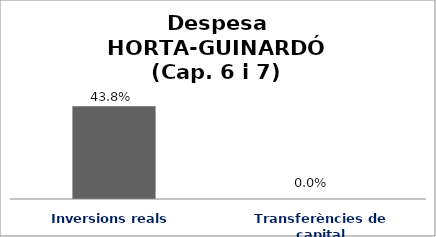
| Category | Series 0 |
|---|---|
| Inversions reals | 0.438 |
| Transferències de capital | 0 |